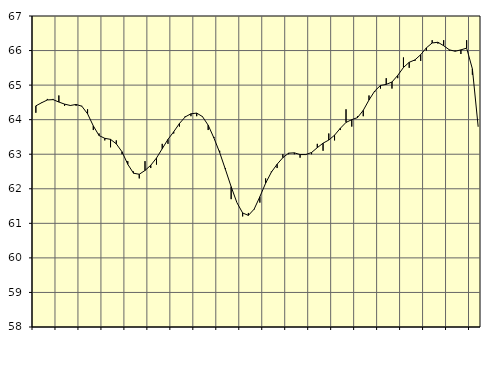
| Category | Piggar | Series 1 |
|---|---|---|
| nan | 64.2 | 64.4 |
| 1.0 | 64.5 | 64.49 |
| 1.0 | 64.6 | 64.57 |
| 1.0 | 64.6 | 64.58 |
| nan | 64.7 | 64.51 |
| 2.0 | 64.4 | 64.45 |
| 2.0 | 64.4 | 64.41 |
| 2.0 | 64.4 | 64.44 |
| nan | 64.4 | 64.39 |
| 3.0 | 64.3 | 64.17 |
| 3.0 | 63.7 | 63.82 |
| 3.0 | 63.6 | 63.54 |
| nan | 63.4 | 63.46 |
| 4.0 | 63.2 | 63.43 |
| 4.0 | 63.4 | 63.3 |
| 4.0 | 63 | 63.07 |
| nan | 62.8 | 62.71 |
| 5.0 | 62.5 | 62.45 |
| 5.0 | 62.3 | 62.42 |
| 5.0 | 62.8 | 62.53 |
| nan | 62.6 | 62.68 |
| 6.0 | 62.7 | 62.89 |
| 6.0 | 63.3 | 63.16 |
| 6.0 | 63.3 | 63.43 |
| nan | 63.6 | 63.65 |
| 7.0 | 63.8 | 63.89 |
| 7.0 | 64.1 | 64.08 |
| 7.0 | 64.1 | 64.17 |
| nan | 64.1 | 64.19 |
| 8.0 | 64.1 | 64.09 |
| 8.0 | 63.7 | 63.84 |
| 8.0 | 63.5 | 63.47 |
| nan | 63.1 | 63.05 |
| 9.0 | 62.6 | 62.56 |
| 9.0 | 61.7 | 62.06 |
| 9.0 | 61.6 | 61.6 |
| nan | 61.2 | 61.3 |
| 10.0 | 61.3 | 61.23 |
| 10.0 | 61.4 | 61.41 |
| 10.0 | 61.6 | 61.77 |
| nan | 62.3 | 62.16 |
| 11.0 | 62.5 | 62.48 |
| 11.0 | 62.6 | 62.71 |
| 11.0 | 63 | 62.9 |
| nan | 63 | 63.03 |
| 12.0 | 63 | 63.04 |
| 12.0 | 62.9 | 62.99 |
| 12.0 | 63 | 62.99 |
| nan | 63 | 63.05 |
| 13.0 | 63.3 | 63.19 |
| 13.0 | 63.1 | 63.32 |
| 13.0 | 63.6 | 63.41 |
| nan | 63.4 | 63.55 |
| 14.0 | 63.7 | 63.75 |
| 14.0 | 64.3 | 63.92 |
| 14.0 | 63.8 | 64 |
| nan | 64.1 | 64.06 |
| 15.0 | 64.1 | 64.27 |
| 15.0 | 64.7 | 64.57 |
| 15.0 | 64.8 | 64.83 |
| nan | 64.9 | 64.99 |
| 16.0 | 65.2 | 65.02 |
| 16.0 | 64.9 | 65.09 |
| 16.0 | 65.2 | 65.28 |
| nan | 65.8 | 65.51 |
| 17.0 | 65.5 | 65.66 |
| 17.0 | 65.7 | 65.73 |
| 17.0 | 65.7 | 65.88 |
| nan | 66 | 66.08 |
| 18.0 | 66.3 | 66.22 |
| 18.0 | 66.2 | 66.24 |
| 18.0 | 66.3 | 66.14 |
| nan | 66 | 66.02 |
| 19.0 | 66 | 65.98 |
| 19.0 | 65.9 | 66.02 |
| 19.0 | 66.3 | 66.07 |
| nan | 65.3 | 65.47 |
| 20.0 | 63.8 | 63.81 |